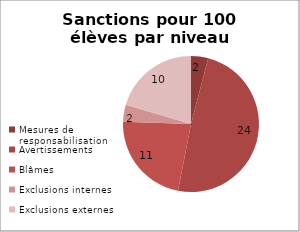
| Category | Series 0 |
|---|---|
| Mesures de responsabilisation | 2 |
| Avertissements | 24 |
| Blâmes | 11 |
| Exclusions internes | 2 |
| Exclusions externes | 10 |